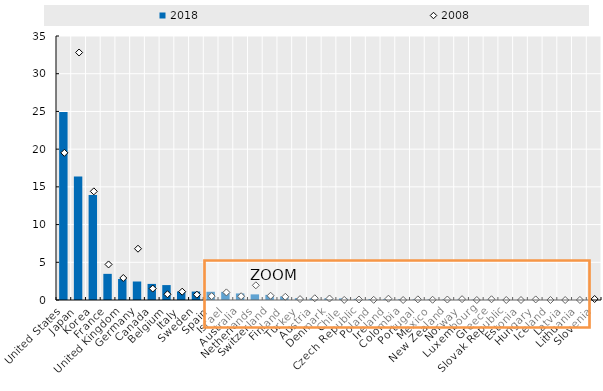
| Category | 2018 |
|---|---|
| United States | 24.93 |
| Japan | 16.389 |
| Korea | 13.913 |
| France | 3.466 |
| United Kingdom | 2.782 |
| Germany | 2.452 |
| Canada | 2.134 |
| Belgium | 1.978 |
| Italy | 1.135 |
| Sweden | 1.118 |
| Spain | 1.09 |
| Israel | 1.078 |
| Australia | 0.87 |
| Netherlands | 0.746 |
| Switzerland | 0.68 |
| Finland | 0.477 |
| Turkey | 0.244 |
| Austria | 0.22 |
| Denmark | 0.22 |
| Chile | 0.211 |
| Czech Republic | 0.151 |
| Poland | 0.131 |
| Ireland | 0.113 |
| Colombia | 0.09 |
| Portugal | 0.088 |
| Mexico | 0.06 |
| New Zealand | 0.057 |
| Norway | 0.05 |
| Luxembourg | 0.045 |
| Greece | 0.03 |
| Slovak Republic | 0.015 |
| Estonia | 0 |
| Hungary | 0 |
| Iceland | 0 |
| Latvia | 0 |
| Lithuania | 0 |
| Slovenia | 0 |